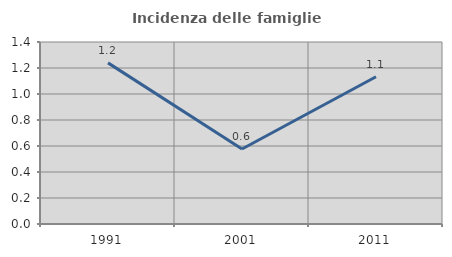
| Category | Incidenza delle famiglie numerose |
|---|---|
| 1991.0 | 1.239 |
| 2001.0 | 0.577 |
| 2011.0 | 1.133 |